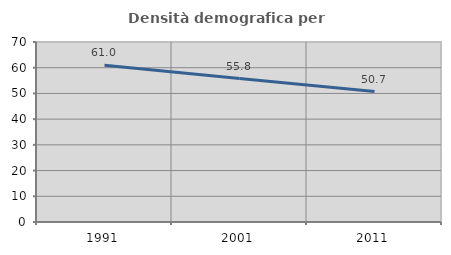
| Category | Densità demografica |
|---|---|
| 1991.0 | 60.987 |
| 2001.0 | 55.773 |
| 2011.0 | 50.714 |